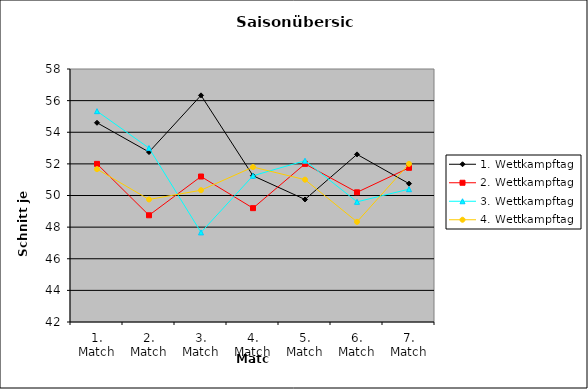
| Category | 1. Wettkampftag | 2. Wettkampftag | 3. Wettkampftag | 4. Wettkampftag |
|---|---|---|---|---|
| 1. Match | 54.6 | 52 | 55.333 | 51.667 |
| 2. Match | 52.75 | 48.75 | 53 | 49.75 |
| 3. Match | 56.333 | 51.2 | 47.667 | 50.333 |
| 4. Match | 51.25 | 49.2 | 51.25 | 51.8 |
| 5. Match | 49.75 | 52 | 52.2 | 51 |
| 6. Match | 52.6 | 50.2 | 49.6 | 48.333 |
| 7. Match | 50.75 | 51.75 | 50.4 | 52 |